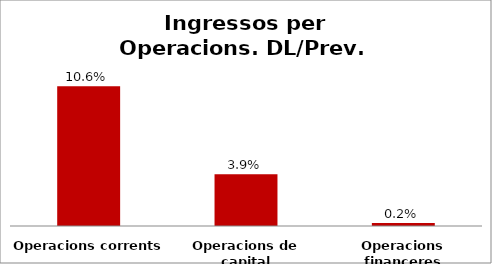
| Category | Series 0 |
|---|---|
| Operacions corrents | 0.106 |
| Operacions de capital | 0.039 |
| Operacions financeres | 0.002 |